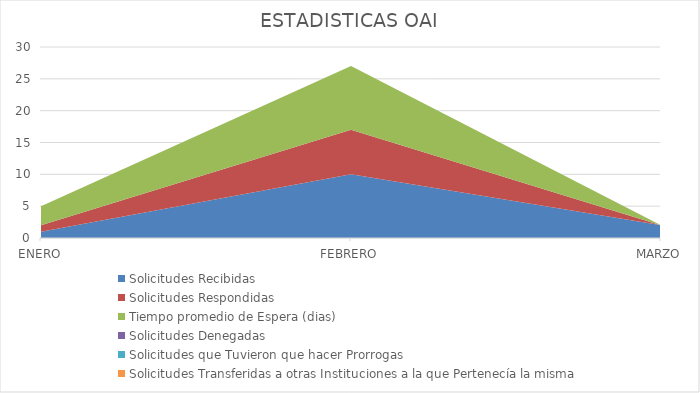
| Category | Solicitudes Recibidas | Solicitudes Respondidas | Tiempo promedio de Espera (dias) | Solicitudes Denegadas | Solicitudes que Tuvieron que hacer Prorrogas  | Solicitudes Transferidas a otras Instituciones a la que Pertenecía la misma |
|---|---|---|---|---|---|---|
| ENERO | 1 | 1 | 3 | 0 | 0 | 0 |
| FEBRERO | 10 | 7 | 10 | 0 | 0 | 0 |
| MARZO | 2 | 0 | 0 | 0 | 0 | 0 |